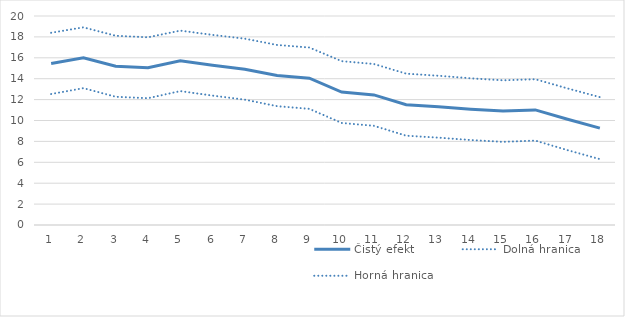
| Category | Čistý efekt | Dolná hranica | Horná hranica |
|---|---|---|---|
| 1.0 | 15.462 | 12.531 | 18.393 |
| 2.0 | 16.006 | 13.097 | 18.915 |
| 3.0 | 15.189 | 12.27 | 18.108 |
| 4.0 | 15.047 | 12.133 | 17.961 |
| 5.0 | 15.707 | 12.812 | 18.602 |
| 6.0 | 15.289 | 12.384 | 18.194 |
| 7.0 | 14.912 | 11.995 | 17.829 |
| 8.0 | 14.301 | 11.371 | 17.231 |
| 9.0 | 14.05 | 11.115 | 16.984 |
| 10.0 | 12.722 | 9.765 | 15.68 |
| 11.0 | 12.45 | 9.493 | 15.407 |
| 12.0 | 11.514 | 8.545 | 14.482 |
| 13.0 | 11.321 | 8.359 | 14.283 |
| 14.0 | 11.084 | 8.13 | 14.038 |
| 15.0 | 10.902 | 7.957 | 13.846 |
| 16.0 | 11.012 | 8.077 | 13.947 |
| 17.0 | 10.114 | 7.16 | 13.069 |
| 18.0 | 9.269 | 6.303 | 12.235 |